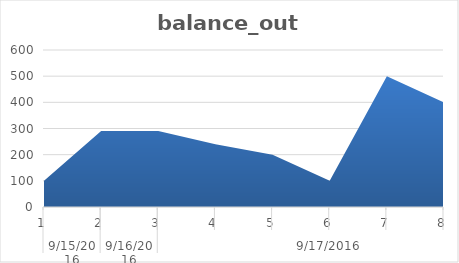
| Category | balance_out |
|---|---|
| 0 | 100 |
| 1 | 290 |
| 2 | 290 |
| 3 | 240 |
| 4 | 200 |
| 5 | 100 |
| 6 | 500 |
| 7 | 400 |